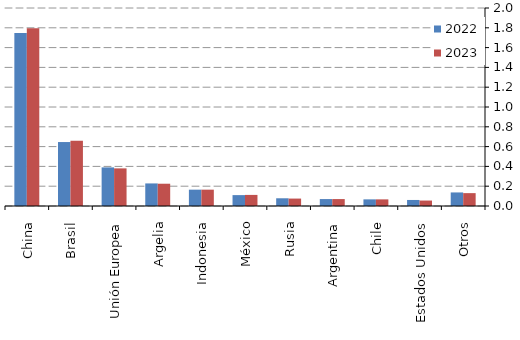
| Category | 2022 | 2023 |
|---|---|---|
| China | 1747 | 1795 |
| Brasil | 646 | 660 |
| Unión Europea | 390 | 380 |
| Argelia | 228 | 225 |
| Indonesia | 165 | 165 |
| México | 110 | 112 |
| Rusia | 78 | 75 |
| Argentina | 70 | 70 |
| Chile | 67 | 67 |
| Estados Unidos | 61 | 55 |
| Otros | 137 | 130 |